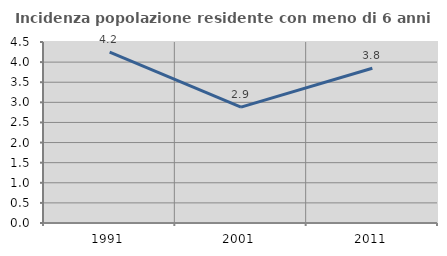
| Category | Incidenza popolazione residente con meno di 6 anni |
|---|---|
| 1991.0 | 4.247 |
| 2001.0 | 2.88 |
| 2011.0 | 3.846 |